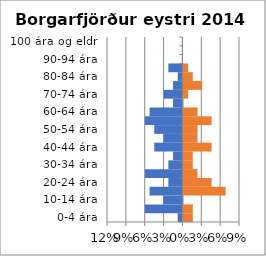
| Category | % karlar | %konur |
|---|---|---|
| 0-4 ára | -0.007 | 0.015 |
| 5-9 ára | -0.06 | 0.015 |
| 10-14 ára | -0.03 | 0 |
| 15-19 ára | -0.052 | 0.067 |
| 20-24 ára | -0.022 | 0.045 |
| 25-29 ára | -0.06 | 0.022 |
| 30-34 ára | -0.022 | 0.015 |
| 35-39 ára | -0.015 | 0.015 |
| 40-44 ára | -0.045 | 0.045 |
| 45-49 ára | -0.03 | 0.022 |
| 50-54 ára | -0.045 | 0.022 |
| 55-59 ára | -0.06 | 0.045 |
| 60-64 ára | -0.052 | 0.022 |
| 65-69 ára | -0.015 | 0 |
| 70-74 ára | -0.03 | 0.007 |
| 75-79 ára | -0.015 | 0.03 |
| 80-84 ára | -0.007 | 0.015 |
| 85-89 ára | -0.022 | 0.007 |
| 90-94 ára | 0 | 0 |
| 95-99 ára | 0 | 0 |
| 100 ára og eldri | 0 | 0 |